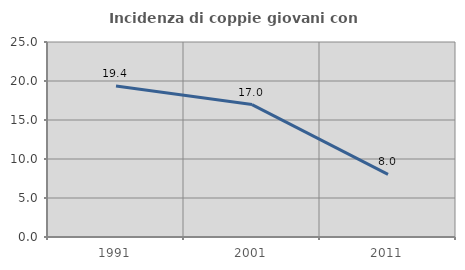
| Category | Incidenza di coppie giovani con figli |
|---|---|
| 1991.0 | 19.355 |
| 2001.0 | 16.981 |
| 2011.0 | 8.036 |